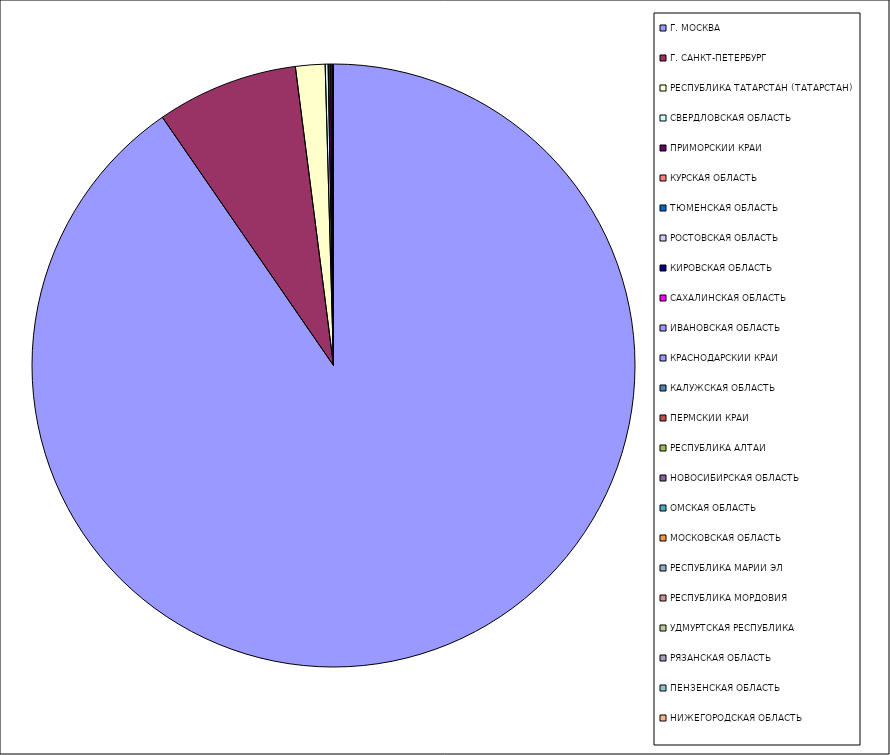
| Category | Оборот |
|---|---|
| Г. МОСКВА | 90.391 |
| Г. САНКТ-ПЕТЕРБУРГ | 7.585 |
| РЕСПУБЛИКА ТАТАРСТАН (ТАТАРСТАН) | 1.58 |
| СВЕРДЛОВСКАЯ ОБЛАСТЬ | 0.158 |
| ПРИМОРСКИЙ КРАЙ | 0.135 |
| КУРСКАЯ ОБЛАСТЬ | 0.077 |
| ТЮМЕНСКАЯ ОБЛАСТЬ | 0.012 |
| РОСТОВСКАЯ ОБЛАСТЬ | 0.011 |
| КИРОВСКАЯ ОБЛАСТЬ | 0.01 |
| САХАЛИНСКАЯ ОБЛАСТЬ | 0.006 |
| ИВАНОВСКАЯ ОБЛАСТЬ | 0.006 |
| КРАСНОДАРСКИЙ КРАЙ | 0.006 |
| КАЛУЖСКАЯ ОБЛАСТЬ | 0.003 |
| ПЕРМСКИЙ КРАЙ | 0.003 |
| РЕСПУБЛИКА АЛТАЙ | 0.003 |
| НОВОСИБИРСКАЯ ОБЛАСТЬ | 0.002 |
| ОМСКАЯ ОБЛАСТЬ | 0.002 |
| МОСКОВСКАЯ ОБЛАСТЬ | 0.002 |
| РЕСПУБЛИКА МАРИЙ ЭЛ | 0.001 |
| РЕСПУБЛИКА МОРДОВИЯ | 0.001 |
| УДМУРТСКАЯ РЕСПУБЛИКА | 0.001 |
| РЯЗАНСКАЯ ОБЛАСТЬ | 0.001 |
| ПЕНЗЕНСКАЯ ОБЛАСТЬ | 0.001 |
| НИЖЕГОРОДСКАЯ ОБЛАСТЬ | 0 |